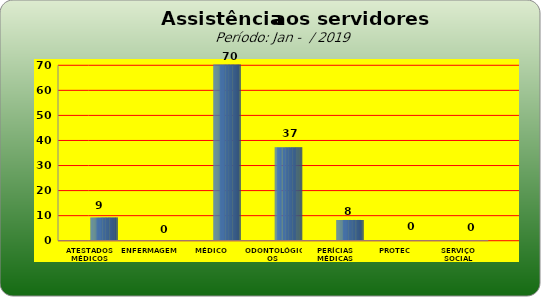
| Category | Series 0 |
|---|---|
| ATESTADOS MÉDICOS | 9 |
| ENFERMAGEM | 0 |
| MÉDICO | 70 |
| ODONTOLÓGICOS | 37 |
| PERÍCIAS MÉDICAS | 8 |
| PROTEC | 0 |
| SERVIÇO SOCIAL | 0 |